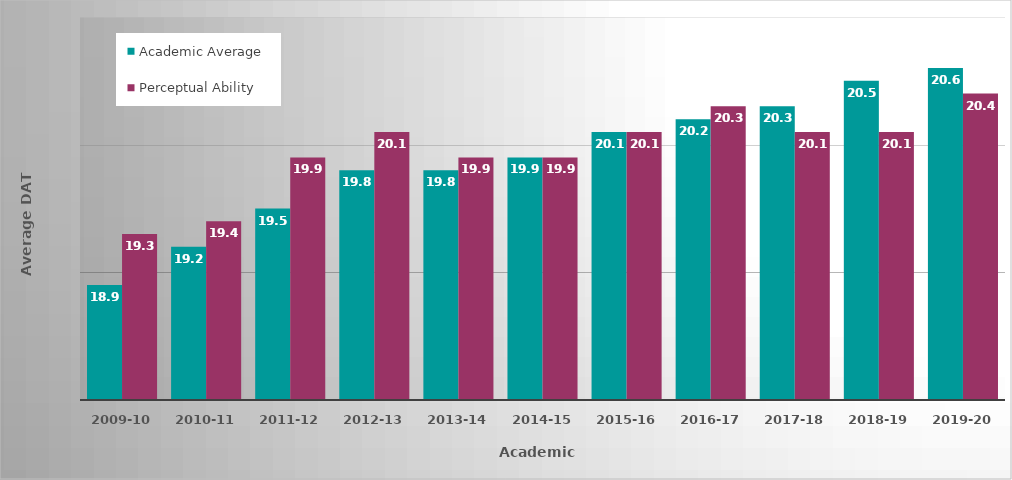
| Category | Academic Average | Perceptual Ability |
|---|---|---|
| 2009-10 | 18.9 | 19.3 |
| 2010-11 | 19.2 | 19.4 |
| 2011-12 | 19.5 | 19.9 |
| 2012-13 | 19.8 | 20.1 |
| 2013-14 | 19.8 | 19.9 |
| 2014-15 | 19.9 | 19.9 |
| 2015-16 | 20.1 | 20.1 |
| 2016-17 | 20.2 | 20.3 |
| 2017-18 | 20.3 | 20.1 |
| 2018-19 | 20.5 | 20.1 |
| 2019-20 | 20.6 | 20.4 |